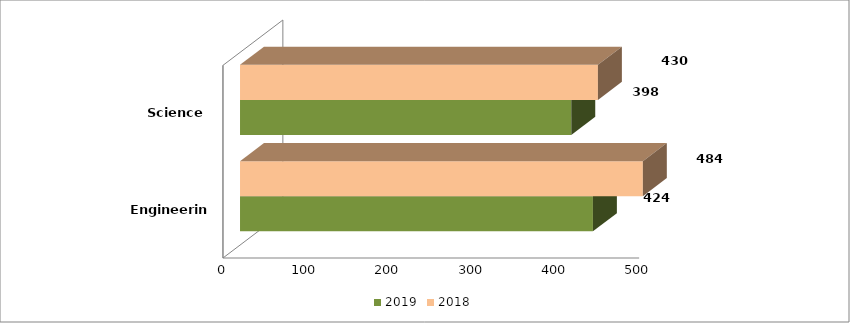
| Category | 2019 | 2018 |
|---|---|---|
| Engineering | 424 | 484 |
| Science | 398 | 430 |